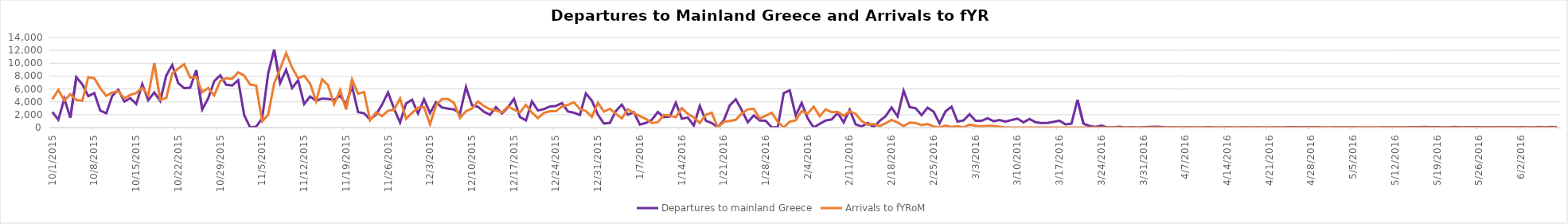
| Category | Departures to mainland Greece | Arrivals to fYRoM |
|---|---|---|
| 10/1/15 | 2409 | 4370 |
| 10/2/15 | 1215 | 5853 |
| 10/3/15 | 4480 | 4202 |
| 10/4/15 | 1513 | 5181 |
| 10/5/15 | 7833 | 4282 |
| 10/6/15 | 6707 | 4156 |
| 10/7/15 | 4886 | 7816 |
| 10/8/15 | 5349 | 7663 |
| 10/9/15 | 2631 | 6107 |
| 10/10/15 | 2214 | 4922 |
| 10/11/15 | 4950 | 5448 |
| 10/12/15 | 5879 | 5645 |
| 10/13/15 | 4052 | 4551 |
| 10/14/15 | 4564 | 5073 |
| 10/15/15 | 3660 | 5373 |
| 10/16/15 | 6743 | 6181 |
| 10/17/15 | 4239 | 4988 |
| 10/18/15 | 5457 | 10005 |
| 10/19/15 | 4119 | 4299 |
| 10/20/15 | 8083 | 4584 |
| 10/21/15 | 9725 | 8384 |
| 10/22/15 | 6896 | 9174 |
| 10/23/15 | 6120 | 9840 |
| 10/24/15 | 6195 | 7752 |
| 10/25/15 | 8916 | 7864 |
| 10/26/15 | 2804 | 5500 |
| 10/27/15 | 4540 | 6146 |
| 10/28/15 | 7191 | 5000 |
| 10/29/15 | 8117 | 7231 |
| 10/30/15 | 6649 | 7663 |
| 10/31/15 | 6537 | 7590 |
| 11/1/15 | 7360 | 8584 |
| 11/2/15 | 1935 | 8075 |
| 11/3/15 | 0 | 6682 |
| 11/4/15 | 142 | 6532 |
| 11/5/15 | 1430 | 960 |
| 11/6/15 | 8392 | 1987 |
| 11/7/15 | 12116 | 6847 |
| 11/8/15 | 6902 | 9148 |
| 11/9/15 | 8977 | 11572 |
| 11/10/15 | 6133 | 9305 |
| 11/11/15 | 7354 | 7651 |
| 11/12/15 | 3650 | 8038 |
| 11/13/15 | 4820 | 6826 |
| 11/14/15 | 4171 | 4107 |
| 11/15/15 | 4497 | 7511 |
| 11/16/15 | 4442 | 6557 |
| 11/17/15 | 4289 | 3621 |
| 11/18/15 | 4927 | 5831 |
| 11/19/15 | 3644 | 2816 |
| 11/20/15 | 6389 | 7453 |
| 11/21/15 | 2401 | 5255 |
| 11/22/15 | 2214 | 5539 |
| 11/23/15 | 1245 | 1113 |
| 11/24/15 | 2006 | 2347 |
| 11/25/15 | 3565 | 1779 |
| 11/26/15 | 5435 | 2617 |
| 11/27/15 | 2932 | 2744 |
| 11/28/15 | 778 | 4520 |
| 11/29/15 | 3736 | 1373 |
| 11/30/15 | 4318 | 2270 |
| 12/1/15 | 2181 | 3094 |
| 12/2/15 | 4384 | 3174 |
| 12/3/15 | 2255 | 494 |
| 12/4/15 | 3934 | 3436 |
| 12/5/15 | 3115 | 4430 |
| 12/6/15 | 2943 | 4425 |
| 12/7/15 | 2810 | 3826 |
| 12/8/15 | 2189 | 1508 |
| 12/9/15 | 6316 | 2550 |
| 12/10/15 | 3456 | 2956 |
| 12/11/15 | 3219 | 4047 |
| 12/12/15 | 2453 | 3338 |
| 12/13/15 | 1976 | 2849 |
| 12/14/15 | 3175 | 2644 |
| 12/15/15 | 2191 | 2349 |
| 12/16/15 | 3137 | 3264 |
| 12/17/15 | 4461 | 2801 |
| 12/18/15 | 1638 | 2332 |
| 12/19/15 | 1110 | 3515 |
| 12/20/15 | 4070 | 2338 |
| 12/21/15 | 2652 | 1470 |
| 12/22/15 | 2864 | 2272 |
| 12/23/15 | 3278 | 2529 |
| 12/24/15 | 3349 | 2529 |
| 12/25/15 | 3806 | 3268 |
| 12/26/15 | 2498 | 3521 |
| 12/27/15 | 2311 | 3938 |
| 12/28/15 | 1946 | 2884 |
| 12/29/15 | 5309 | 2577 |
| 12/30/15 | 4178 | 1665 |
| 12/31/15 | 2009 | 3848 |
| 1/1/16 | 623 | 2454 |
| 1/2/16 | 720 | 2918 |
| 1/3/16 | 2569 | 2112 |
| 1/4/16 | 3563 | 1415 |
| 1/5/16 | 1998 | 2842 |
| 1/6/16 | 2377 | 2258 |
| 1/7/16 | 463 | 1776 |
| 1/8/16 | 716 | 1344 |
| 1/9/16 | 1203 | 715 |
| 1/10/16 | 2417 | 819 |
| 1/11/16 | 1621 | 1959 |
| 1/12/16 | 1701 | 1840 |
| 1/13/16 | 3861 | 1600 |
| 1/14/16 | 1378 | 3022 |
| 1/15/16 | 1551 | 2119 |
| 1/16/16 | 301 | 1598 |
| 1/17/16 | 3378 | 720 |
| 1/18/16 | 1078 | 1980 |
| 1/19/16 | 695 | 2298 |
| 1/20/16 | 50 | 0 |
| 1/21/16 | 1108 | 892 |
| 1/22/16 | 3451 | 1030 |
| 1/23/16 | 4397 | 1208 |
| 1/24/16 | 2706 | 2174 |
| 1/25/16 | 819 | 2836 |
| 1/26/16 | 1887 | 2908 |
| 1/27/16 | 1098 | 1402 |
| 1/28/16 | 1046 | 1837 |
| 1/29/16 | 40 | 2292 |
| 1/30/16 | 53 | 931 |
| 1/31/16 | 5342 | 0 |
| 2/1/16 | 5783 | 908 |
| 2/2/16 | 1878 | 1121 |
| 2/3/16 | 3829 | 2558 |
| 2/4/16 | 1436 | 2173 |
| 2/5/16 | 0 | 3259 |
| 2/6/16 | 578 | 1780 |
| 2/7/16 | 1097 | 2838 |
| 2/8/16 | 1259 | 2392 |
| 2/9/16 | 2283 | 2441 |
| 2/10/16 | 793 | 1817 |
| 2/11/16 | 2756 | 2540 |
| 2/12/16 | 496 | 2115 |
| 2/13/16 | 161 | 1019 |
| 2/14/16 | 724 | 452 |
| 2/15/16 | 65 | 542 |
| 2/16/16 | 1024 | 234 |
| 2/17/16 | 1772 | 668 |
| 2/18/16 | 3118 | 1200 |
| 2/19/16 | 1731 | 799 |
| 2/20/16 | 5738 | 209 |
| 2/21/16 | 3180 | 774 |
| 2/22/16 | 3002 | 714 |
| 2/23/16 | 1927 | 382 |
| 2/24/16 | 3086 | 551 |
| 2/25/16 | 2468 | 168 |
| 2/26/16 | 649 | 20 |
| 2/27/16 | 2525 | 310 |
| 2/28/16 | 3234 | 92 |
| 2/29/16 | 920 | 208 |
| 3/1/16 | 1107 | 30 |
| 3/2/16 | 2073 | 457 |
| 3/3/16 | 1061 | 269 |
| 3/4/16 | 1035 | 177 |
| 3/5/16 | 1444 | 293 |
| 3/6/16 | 980 | 261 |
| 3/7/16 | 1171 | 127 |
| 3/8/16 | 922 | 0 |
| 3/9/16 | 1169 | 0 |
| 3/10/16 | 1381 | 0 |
| 3/11/16 | 810 | 0 |
| 3/12/16 | 1326 | 0 |
| 3/13/16 | 831 | 0 |
| 3/14/16 | 693 | 0 |
| 3/15/16 | 721 | 0 |
| 3/16/16 | 882 | 0 |
| 3/17/16 | 1068 | 0 |
| 3/18/16 | 489 | 0 |
| 3/19/16 | 608 | 0 |
| 3/20/16 | 4314 | 0 |
| 3/21/16 | 616 | 0 |
| 3/22/16 | 254 | 0 |
| 3/23/16 | 95 | 0 |
| 3/24/16 | 316 | 0 |
| 3/25/16 | 22 | 0 |
| 3/26/16 | 25 | 0 |
| 3/27/16 | 113 | 0 |
| 3/28/16 | 0 | 0 |
| 3/29/16 | 76 | 0 |
| 3/30/16 | 11 | 0 |
| 3/31/16 | 68 | 0 |
| 4/1/16 | 102 | 0 |
| 4/2/16 | 132 | 0 |
| 4/3/16 | 105 | 0 |
| 4/4/16 | 0 | 0 |
| 4/5/16 | 31 | 0 |
| 4/6/16 | 7 | 0 |
| 4/7/16 | 32 | 0 |
| 4/8/16 | 17 | 0 |
| 4/9/16 | 14 | 0 |
| 4/10/16 | 16 | 0 |
| 4/11/16 | 64 | 0 |
| 4/12/16 | 5 | 0 |
| 4/13/16 | 10 | 0 |
| 4/14/16 | 36 | 0 |
| 4/15/16 | 0 | 0 |
| 4/16/16 | 0 | 0 |
| 4/17/16 | 34 | 0 |
| 4/18/16 | 9 | 0 |
| 4/19/16 | 39 | 0 |
| 4/20/16 | 7 | 0 |
| 4/21/16 | 7 | 0 |
| 4/22/16 | 16 | 0 |
| 4/23/16 | 0 | 0 |
| 4/24/16 | 51 | 0 |
| 4/25/16 | 54 | 0 |
| 4/26/16 | 17 | 0 |
| 4/27/16 | 52 | 0 |
| 4/28/16 | 16 | 0 |
| 4/29/16 | 56 | 0 |
| 4/30/16 | 4 | 0 |
| 5/1/16 | 0 | 0 |
| 5/2/16 | 25 | 0 |
| 5/3/16 | 34 | 0 |
| 5/4/16 | 41 | 0 |
| 5/5/16 | 37 | 0 |
| 5/6/16 | 1 | 0 |
| 5/7/16 | 0 | 0 |
| 5/8/16 | 0 | 0 |
| 5/9/16 | 5 | 0 |
| 5/10/16 | 46 | 0 |
| 5/11/16 | 40 | 0 |
| 5/12/16 | 39 | 0 |
| 5/13/16 | 31 | 0 |
| 5/14/16 | 22 | 0 |
| 5/15/16 | 75 | 0 |
| 5/16/16 | 51 | 0 |
| 5/17/16 | 88 | 0 |
| 5/18/16 | 64 | 0 |
| 5/19/16 | 62 | 0 |
| 5/20/16 | 39 | 0 |
| 5/21/16 | 31 | 0 |
| 5/22/16 | 93 | 0 |
| 5/23/16 | 27 | 0 |
| 5/24/16 | 48 | 0 |
| 5/25/16 | 70 | 0 |
| 5/26/16 | 60 | 0 |
| 5/27/16 | 31 | 0 |
| 5/28/16 | 31 | 0 |
| 5/29/16 | 62 | 0 |
| 5/30/16 | 35 | 0 |
| 5/31/16 | 57 | 0 |
| 6/1/16 | 36 | 0 |
| 6/2/16 | 57 | 0 |
| 6/3/16 | 29 | 0 |
| 6/4/16 | 28 | 0 |
| 6/5/16 | 99 | 0 |
| 6/6/16 | 34 | 0 |
| 6/7/16 | 105 | 0 |
| 6/8/16 | 65 | 0 |